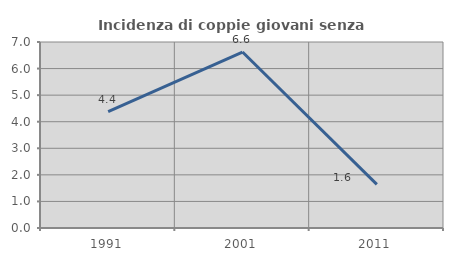
| Category | Incidenza di coppie giovani senza figli |
|---|---|
| 1991.0 | 4.377 |
| 2001.0 | 6.623 |
| 2011.0 | 1.639 |